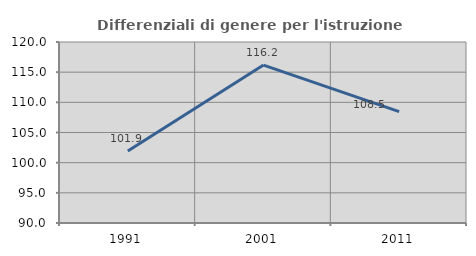
| Category | Differenziali di genere per l'istruzione superiore |
|---|---|
| 1991.0 | 101.932 |
| 2001.0 | 116.175 |
| 2011.0 | 108.465 |